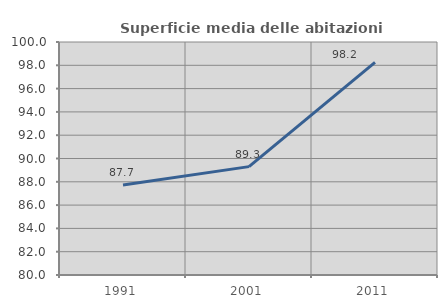
| Category | Superficie media delle abitazioni occupate |
|---|---|
| 1991.0 | 87.734 |
| 2001.0 | 89.301 |
| 2011.0 | 98.249 |